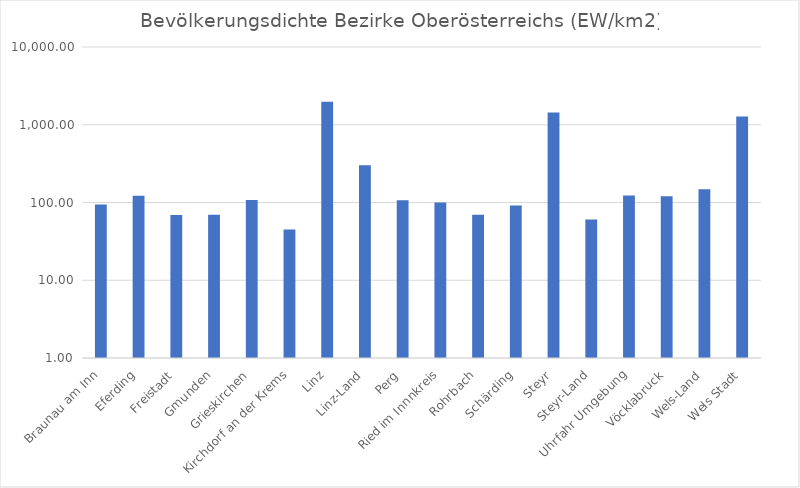
| Category | Series 0 |
|---|---|
| Braunau am Inn | 94.063 |
| Eferding | 122.316 |
| Freistadt | 68.976 |
| Gmunden | 69.367 |
| Grieskirchen | 108.04 |
| Kirchdorf an der Krems | 44.84 |
| Linz | 1978.216 |
| Linz-Land | 302.229 |
| Perg | 107.205 |
| Ried im Innnkreis | 100.262 |
| Rohrbach | 69.386 |
| Schärding | 91.23 |
| Steyr | 1439.525 |
| Steyr-Land | 60.329 |
| Uhrfahr Umgebung | 123.333 |
| Vöcklabruck | 120.218 |
| Wels-Land | 148.449 |
| Wels Stadt | 1275.936 |